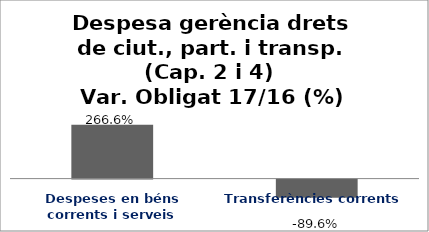
| Category | Series 0 |
|---|---|
| Despeses en béns corrents i serveis | 2.666 |
| Transferències corrents | -0.896 |